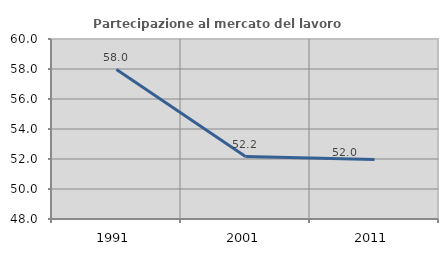
| Category | Partecipazione al mercato del lavoro  femminile |
|---|---|
| 1991.0 | 57.962 |
| 2001.0 | 52.165 |
| 2011.0 | 51.963 |